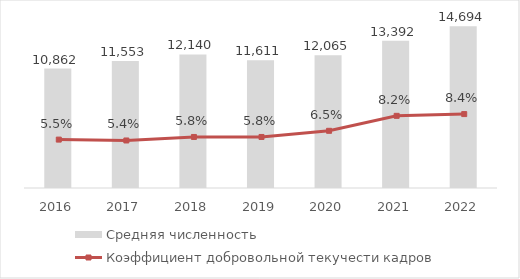
| Category | Средняя численность |
|---|---|
| 2016.0 | 10862 |
| 2017.0 | 11553 |
| 2018.0 | 12140 |
| 2019.0 | 11611 |
| 2020.0 | 12065 |
| 2021.0 | 13392 |
| 2022.0 | 14694 |